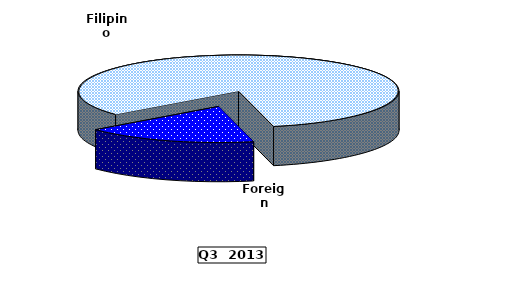
| Category | Series 0 |
|---|---|
| Filipino | 156.33 |
| Foreign | 32.92 |